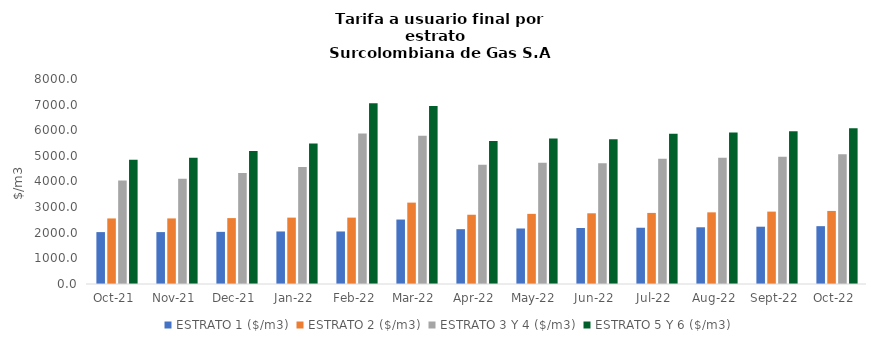
| Category | ESTRATO 1 ($/m3) | ESTRATO 2 ($/m3) | ESTRATO 3 Y 4 ($/m3) | ESTRATO 5 Y 6 ($/m3) |
|---|---|---|---|---|
| 2021-10-01 | 2025.02 | 2558.5 | 4040.72 | 4848.864 |
| 2021-11-01 | 2025.39 | 2558.97 | 4104.53 | 4925.436 |
| 2021-12-01 | 2035.33 | 2571.52 | 4328.76 | 5194.512 |
| 2022-01-01 | 2050.23 | 2590.35 | 4570.18 | 5484.216 |
| 2022-02-01 | 2050.23 | 2590.35 | 5875.34 | 7050.408 |
| 2022-03-01 | 2515.36 | 3176.09 | 5787.27 | 6944.724 |
| 2022-04-01 | 2139.49 | 2703.12 | 4649.66 | 5579.592 |
| 2022-05-01 | 2166.17 | 2736.83 | 4735.45 | 5682.54 |
| 2022-06-01 | 2184.39 | 2759.85 | 4711.05 | 5653.26 |
| 2022-07-01 | 2195.62 | 2774.03 | 4889.25 | 5867.1 |
| 2022-08-01 | 2213.28 | 2796.36 | 4927.85 | 5913.42 |
| 2022-09-01 | 2235.92 | 2824.95 | 4968.53 | 5962.236 |
| 2022-10-01 | 2256.71 | 2851.23 | 5063.68 | 6076.416 |